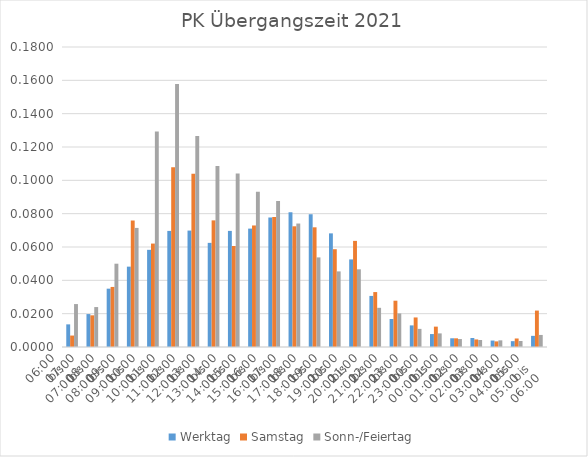
| Category | Werktag | Samstag | Sonn-/Feiertag |
|---|---|---|---|
| 06:00
bis
07:00 | 0.014 | 0.007 | 0.026 |
| 07:00
bis
08:00 | 0.02 | 0.019 | 0.024 |
| 08:00
bis
09:00 | 0.035 | 0.036 | 0.05 |
| 09:00
bis
10:00 | 0.048 | 0.076 | 0.071 |
| 10:00
bis
11:00 | 0.058 | 0.062 | 0.129 |
| 11:00
bis
12:00 | 0.07 | 0.108 | 0.158 |
| 12:00
bis
13:00 | 0.07 | 0.104 | 0.127 |
| 13:00
bis
14:00 | 0.062 | 0.076 | 0.109 |
| 14:00
bis
15:00 | 0.07 | 0.061 | 0.104 |
| 15:00
bis
16:00 | 0.071 | 0.073 | 0.093 |
| 16:00
bis
17:00 | 0.078 | 0.078 | 0.088 |
| 17:00
bis
18:00 | 0.081 | 0.072 | 0.074 |
| 18:00
bis
19:00 | 0.08 | 0.072 | 0.054 |
| 19:00
bis
20:00 | 0.068 | 0.059 | 0.045 |
| 20:00
bis
21:00 | 0.053 | 0.064 | 0.047 |
| 21:00
bis
22:00 | 0.031 | 0.033 | 0.024 |
| 22:00
bis
23:00 | 0.017 | 0.028 | 0.02 |
| 23:00
bis
00:00 | 0.013 | 0.018 | 0.011 |
| 00:00
bis
01:00 | 0.008 | 0.012 | 0.008 |
| 01:00
bis
02:00 | 0.005 | 0.005 | 0.005 |
| 02:00
bis
03:00 | 0.005 | 0.005 | 0.004 |
| 03:00
bis
04:00 | 0.004 | 0.003 | 0.004 |
| 04:00
bis
05:00 | 0.004 | 0.005 | 0.004 |
| 05:00
bis
06:00 | 0.007 | 0.022 | 0.007 |